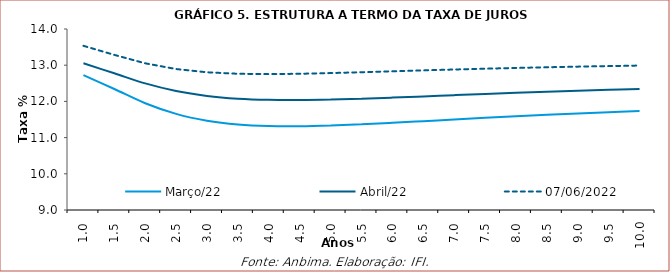
| Category | Março/22 | Abril/22 | 07/06/2022 |
|---|---|---|---|
| 1.0 | 12.728 | 13.054 | 13.535 |
| 1.5 | 12.343 | 12.776 | 13.285 |
| 2.0 | 11.95 | 12.497 | 13.052 |
| 2.5 | 11.655 | 12.288 | 12.894 |
| 3.0 | 11.466 | 12.152 | 12.804 |
| 3.5 | 11.362 | 12.076 | 12.763 |
| 4.0 | 11.317 | 12.043 | 12.754 |
| 4.5 | 11.312 | 12.038 | 12.763 |
| 5.0 | 11.332 | 12.051 | 12.782 |
| 5.5 | 11.367 | 12.075 | 12.806 |
| 6.0 | 11.409 | 12.106 | 12.832 |
| 6.5 | 11.454 | 12.138 | 12.857 |
| 7.0 | 11.5 | 12.172 | 12.881 |
| 7.5 | 11.545 | 12.205 | 12.904 |
| 8.0 | 11.588 | 12.237 | 12.924 |
| 8.5 | 11.628 | 12.267 | 12.943 |
| 9.0 | 11.666 | 12.295 | 12.96 |
| 9.5 | 11.701 | 12.321 | 12.976 |
| 10.0 | 11.733 | 12.346 | 12.99 |